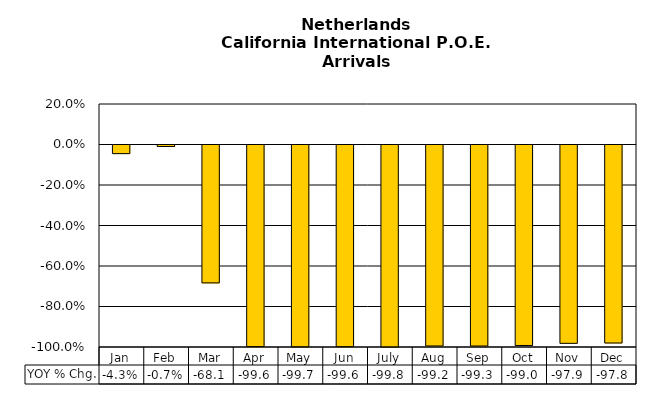
| Category | YOY % Chg. |
|---|---|
| Jan | -0.043 |
| Feb | -0.007 |
| Mar | -0.681 |
| Apr | -0.996 |
| May | -0.997 |
| Jun | -0.996 |
| July | -0.998 |
| Aug | -0.992 |
| Sep | -0.993 |
| Oct | -0.99 |
| Nov | -0.979 |
| Dec | -0.978 |